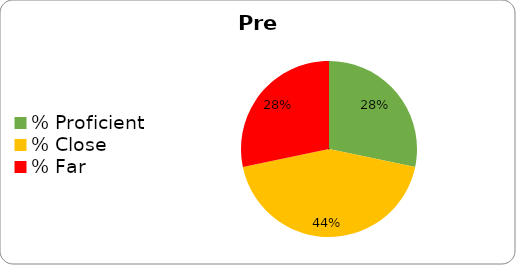
| Category | Series 0 |
|---|---|
| % Proficient | 0.283 |
| % Close | 0.435 |
| % Far | 0.283 |